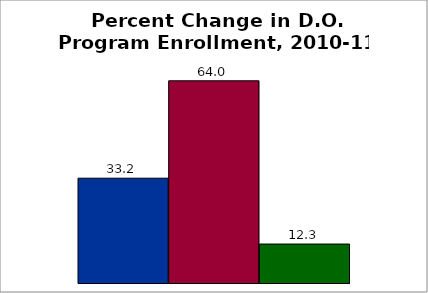
| Category | 50 states and D.C. | SREB states | State |
|---|---|---|---|
| 0 | 33.196 | 64.047 | 12.342 |